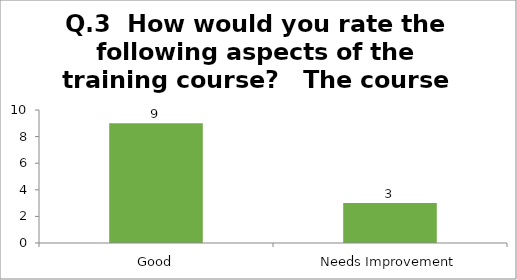
| Category | Q.3  How would you rate the following aspects of the training course?   The course duration |
|---|---|
| Good | 9 |
| Needs Improvement | 3 |